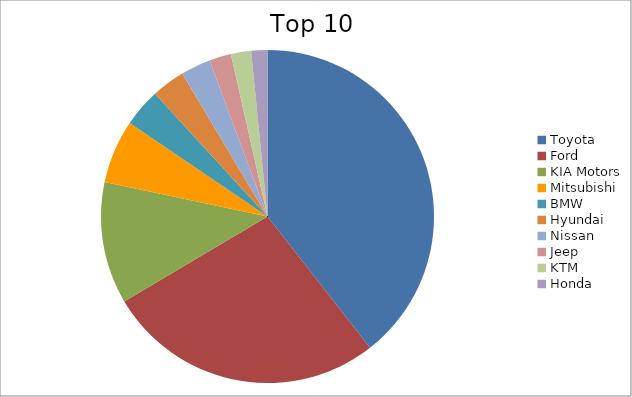
| Category | Series 0 |
|---|---|
| Toyota | 39.43 |
| Ford | 27.04 |
| KIA Motors | 11.83 |
| Mitsubishi | 6.18 |
| BMW | 3.69 |
| Hyundai | 3.25 |
| Nissan | 2.91 |
| Jeep | 2.12 |
| KTM | 1.96 |
| Honda | 1.57 |